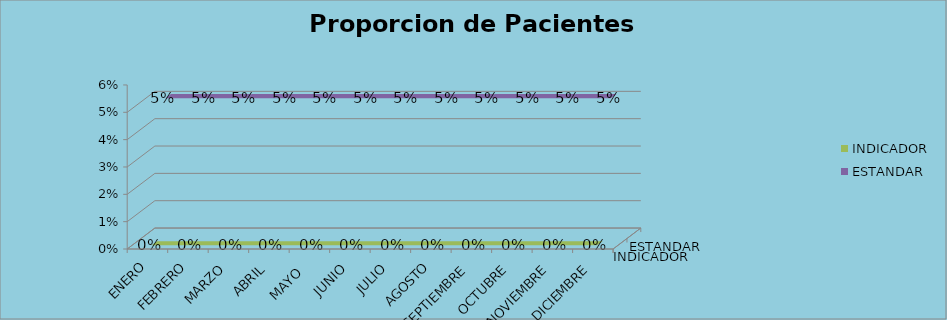
| Category | INDICADOR | ESTANDAR |
|---|---|---|
| ENERO | 0 | 0.05 |
| FEBRERO | 0 | 0.05 |
| MARZO | 0 | 0.05 |
| ABRIL | 0 | 0.05 |
| MAYO  | 0 | 0.05 |
| JUNIO | 0 | 0.05 |
| JULIO | 0 | 0.05 |
| AGOSTO | 0 | 0.05 |
| SEPTIEMBRE | 0 | 0.05 |
| OCTUBRE | 0 | 0.05 |
| NOVIEMBRE | 0 | 0.05 |
| DICIEMBRE | 0 | 0.05 |